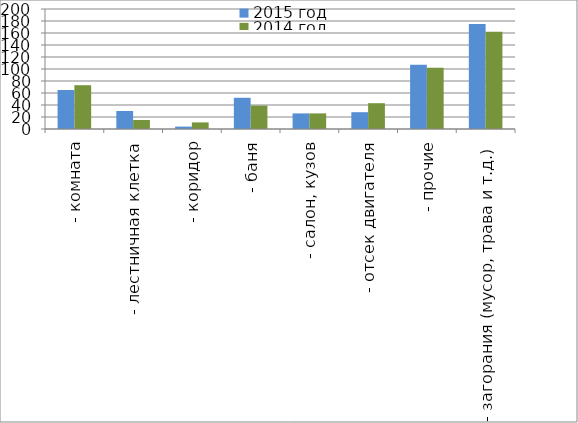
| Category | 2015 год | 2014 год |
|---|---|---|
|  - комната | 65 | 73 |
|  - лестничная клетка | 30 | 15 |
|  - коридор | 4 | 11 |
|  - баня | 52 | 39 |
|  - салон, кузов | 26 | 26 |
|  - отсек двигателя | 28 | 43 |
| - прочие | 107 | 102 |
| - загорания (мусор, трава и т.д.)  | 175 | 162 |